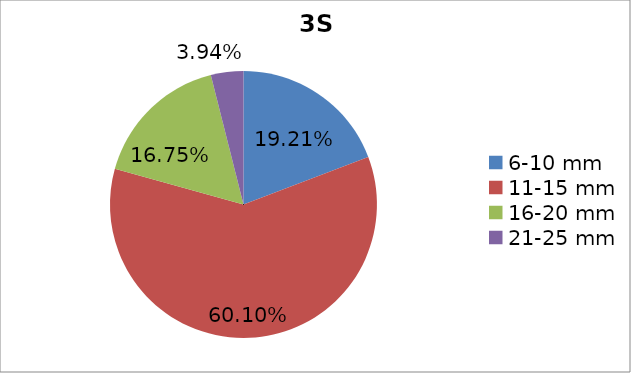
| Category | Series 0 |
|---|---|
| 6-10 mm | 0.192 |
| 11-15 mm | 0.601 |
| 16-20 mm | 0.168 |
| 21-25 mm | 0.039 |